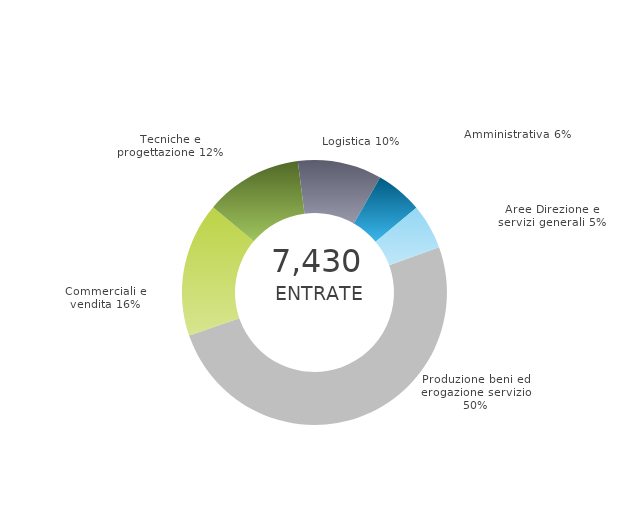
| Category | Series 0 | Series 1 |
|---|---|---|
| Produzione beni ed erogazione servizio | 0 | 0.503 |
| Commerciali e vendita | 0 | 0.164 |
| Tecniche e progettazione | 0 | 0.119 |
| Logistica | 0 | 0.103 |
| Amministrativa | 0 | 0.057 |
| Aree Direzione e servizi generali | 0 | 0.055 |